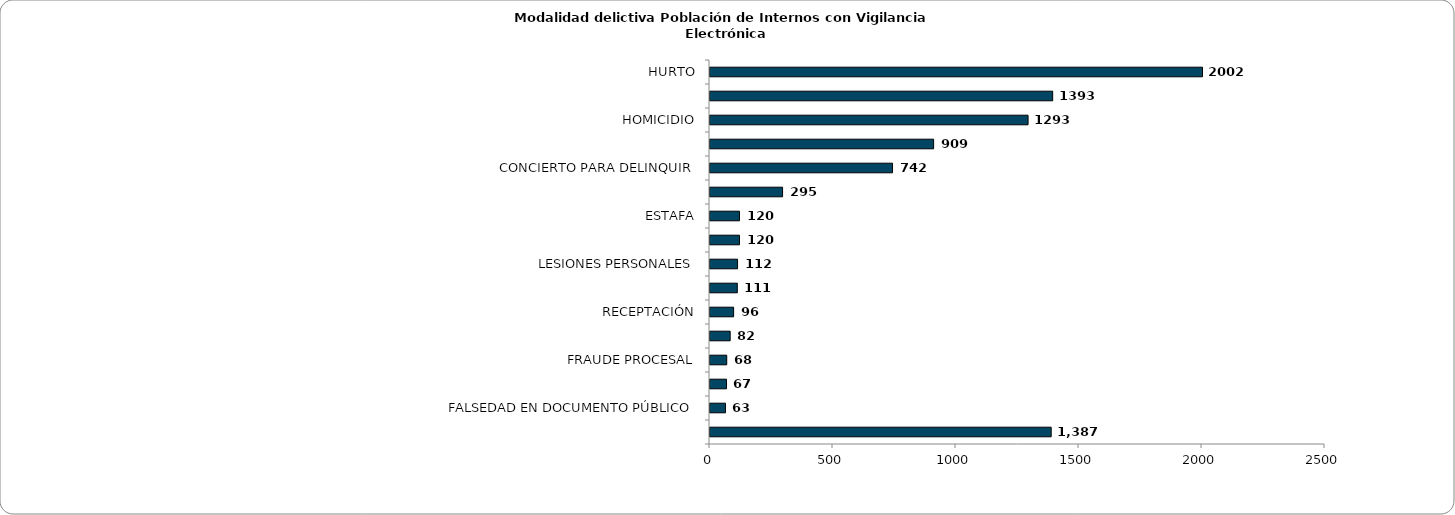
| Category | Series 0 |
|---|---|
| HURTO | 2002 |
| FABRICACION, TRAFICO Y PORTE DE ARMAS DE FUEGO O MUNICIONES | 1393 |
| HOMICIDIO | 1293 |
| TRAFICO, FABRICACIÓN O PORTE DE ESTUPEFACIENTES | 909 |
| CONCIERTO PARA DELINQUIR | 742 |
| FABRICACIÓN, TRÁFICO, PORTE O TENENCIA DE ARMAS DE FUEGO, ACCESORIOS, PARTES O MUNICIONES | 295 |
| ESTAFA | 120 |
| EXTORSIÓN | 120 |
| LESIONES PERSONALES | 112 |
| VIOLENCIA INTRAFAMILIAR | 111 |
| RECEPTACIÓN | 96 |
| SECUESTRO SIMPLE | 82 |
| FRAUDE PROCESAL | 68 |
| FABRICACION TRAFICO Y PORTE DE ARMAS Y MUNICIONES DE USO PRIVATIVO DE LAS FUERZAS ARMADAS | 67 |
| FALSEDAD EN DOCUMENTO PÚBLICO | 63 |
| Otros delitos | 1387 |